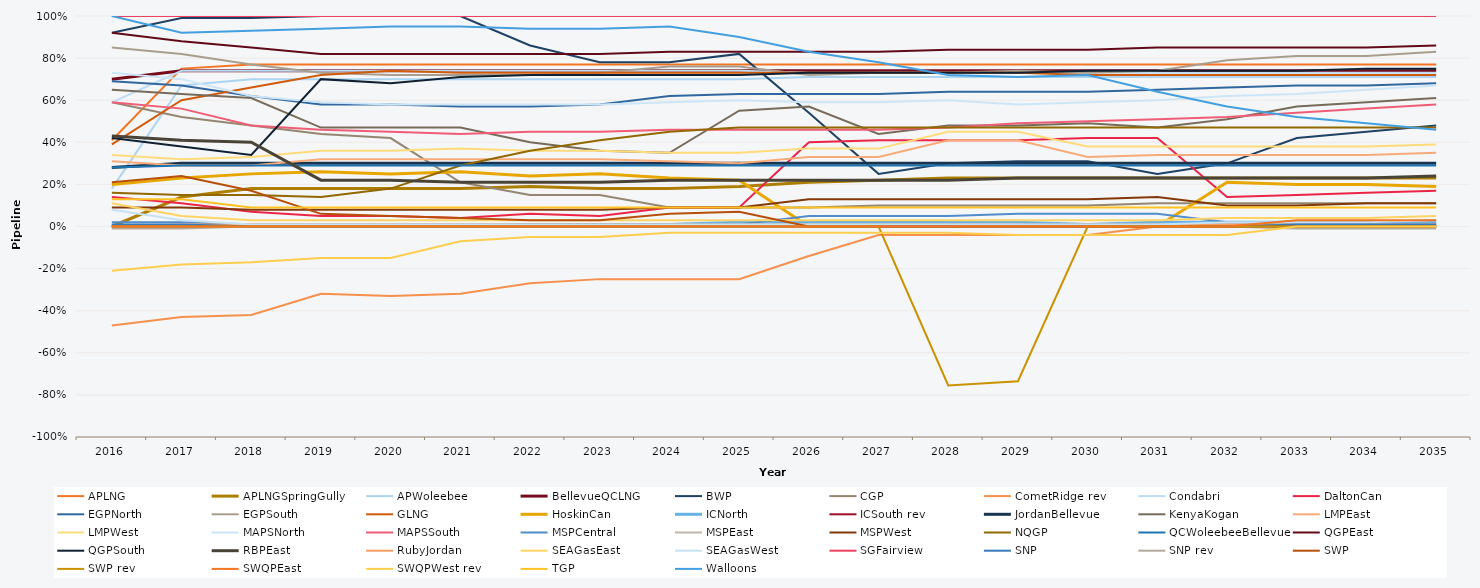
| Category | APLNG | APLNGSpringGully | APWoleebee | BellevueQCLNG | BWP | CGP | CometRidge rev | Condabri | DaltonCan | EGPNorth | EGPSouth | GLNG | HoskinCan | ICNorth | ICSouth rev | JordanBellevue | KenyaKogan | LMPEast | LMPWest | MAPSNorth | MAPSSouth | MSPCentral | MSPEast | MSPWest | NQGP | QCWoleebeeBellevue | QGPEast | QGPSouth | RBPEast | RubyJordan | SEAGasEast | SEAGasWest | SGFairview | SNP | SNP rev | SWP | SWP rev | SWQPEast | SWQPWest rev | TGP | Walloons |
|---|---|---|---|---|---|---|---|---|---|---|---|---|---|---|---|---|---|---|---|---|---|---|---|---|---|---|---|---|---|---|---|---|---|---|---|---|---|---|---|---|---|
| 2016.0 | 0.41 | 0 | 0.18 | 0.7 | 0.92 | 0.59 | -0.47 | 0.59 | 0.14 | 0.69 | 0.85 | 0.39 | 0.2 | 0 | 0 | 0.28 | 0.65 | 0.31 | 0.34 | 0.73 | 0.59 | 0.02 | 0 | 0.09 | 0.16 | 0.28 | 0.92 | 0.42 | 0.43 | 0 | 0.11 | 0.08 | 1 | 0.01 | -0.01 | 0.21 | 0 | 0 | -0.21 | 0.13 | 1 |
| 2017.0 | 0.75 | 0.14 | 0.67 | 0.74 | 0.99 | 0.52 | -0.43 | 0.74 | 0.11 | 0.67 | 0.82 | 0.6 | 0.23 | 0 | 0 | 0.3 | 0.63 | 0.29 | 0.32 | 0.7 | 0.56 | 0.02 | 0 | 0.09 | 0.15 | 0.29 | 0.88 | 0.38 | 0.41 | 0.01 | 0.05 | 0.03 | 1 | 0.01 | -0.01 | 0.24 | 0 | 0 | -0.18 | 0.13 | 0.92 |
| 2018.0 | 0.77 | 0.18 | 0.7 | 0.74 | 0.99 | 0.48 | -0.42 | 0.74 | 0.07 | 0.62 | 0.77 | 0.66 | 0.25 | 0 | 0 | 0.3 | 0.61 | 0.29 | 0.33 | 0.62 | 0.48 | 0.01 | 0 | 0.08 | 0.15 | 0.29 | 0.85 | 0.34 | 0.4 | 0.01 | 0.03 | 0.01 | 1 | 0 | 0 | 0.17 | 0 | 0 | -0.17 | 0.09 | 0.93 |
| 2019.0 | 0.77 | 0.18 | 0.7 | 0.74 | 1 | 0.44 | -0.32 | 0.74 | 0.05 | 0.58 | 0.73 | 0.72 | 0.26 | 0 | 0 | 0.3 | 0.47 | 0.32 | 0.36 | 0.59 | 0.46 | 0.01 | 0 | 0.08 | 0.14 | 0.29 | 0.82 | 0.7 | 0.22 | 0.01 | 0.03 | 0.01 | 1 | 0 | 0 | 0.06 | 0 | 0 | -0.15 | 0.09 | 0.94 |
| 2020.0 | 0.77 | 0.18 | 0.7 | 0.74 | 1 | 0.42 | -0.33 | 0.74 | 0.05 | 0.58 | 0.72 | 0.74 | 0.25 | 0 | 0 | 0.3 | 0.47 | 0.32 | 0.36 | 0.58 | 0.45 | 0.01 | 0 | 0.08 | 0.18 | 0.29 | 0.82 | 0.68 | 0.22 | 0.01 | 0.03 | 0.01 | 1 | 0 | 0 | 0.05 | 0 | 0 | -0.15 | 0.09 | 0.95 |
| 2021.0 | 0.77 | 0.18 | 0.7 | 0.74 | 1 | 0.21 | -0.32 | 0.74 | 0.04 | 0.57 | 0.72 | 0.73 | 0.26 | 0 | 0 | 0.3 | 0.47 | 0.32 | 0.37 | 0.58 | 0.44 | 0.01 | 0 | 0.08 | 0.29 | 0.29 | 0.82 | 0.71 | 0.21 | 0.01 | 0.03 | 0.01 | 1 | 0 | 0 | 0.04 | 0 | 0 | -0.07 | 0.09 | 0.95 |
| 2022.0 | 0.77 | 0.19 | 0.7 | 0.74 | 0.86 | 0.15 | -0.27 | 0.74 | 0.06 | 0.57 | 0.72 | 0.73 | 0.24 | 0.01 | 0 | 0.3 | 0.4 | 0.32 | 0.36 | 0.58 | 0.45 | 0.01 | 0 | 0.08 | 0.36 | 0.29 | 0.82 | 0.72 | 0.21 | 0.01 | 0.03 | 0.01 | 1 | 0 | 0 | 0.03 | 0 | 0 | -0.05 | 0.09 | 0.94 |
| 2023.0 | 0.77 | 0.18 | 0.7 | 0.74 | 0.78 | 0.15 | -0.25 | 0.74 | 0.05 | 0.58 | 0.73 | 0.73 | 0.25 | 0.01 | 0 | 0.3 | 0.36 | 0.32 | 0.36 | 0.58 | 0.45 | 0.01 | 0 | 0.08 | 0.41 | 0.29 | 0.82 | 0.72 | 0.21 | 0.01 | 0.03 | 0.01 | 1 | 0 | 0 | 0.03 | 0 | 0 | -0.05 | 0.09 | 0.94 |
| 2024.0 | 0.77 | 0.18 | 0.7 | 0.74 | 0.78 | 0.09 | -0.25 | 0.74 | 0.09 | 0.62 | 0.76 | 0.73 | 0.23 | 0.01 | 0 | 0.3 | 0.35 | 0.31 | 0.35 | 0.59 | 0.46 | 0.01 | 0 | 0.09 | 0.45 | 0.29 | 0.83 | 0.72 | 0.22 | 0.01 | 0.03 | 0.01 | 1 | 0 | 0 | 0.06 | 0 | 0 | -0.03 | 0.09 | 0.95 |
| 2025.0 | 0.77 | 0.19 | 0.7 | 0.74 | 0.82 | 0.09 | -0.25 | 0.74 | 0.09 | 0.63 | 0.76 | 0.73 | 0.22 | 0.02 | 0 | 0.3 | 0.55 | 0.3 | 0.35 | 0.6 | 0.46 | 0.01 | 0 | 0.09 | 0.47 | 0.29 | 0.83 | 0.72 | 0.22 | 0.01 | 0.03 | 0.01 | 1 | 0 | 0 | 0.07 | 0 | 0 | -0.03 | 0.09 | 0.9 |
| 2026.0 | 0.77 | 0.21 | 0.71 | 0.74 | 0.54 | 0.09 | -0.14 | 0.73 | 0.4 | 0.63 | 0.72 | 0.73 | 0 | 0.02 | 0 | 0.3 | 0.57 | 0.33 | 0.37 | 0.59 | 0.46 | 0.05 | 0 | 0.13 | 0.47 | 0.29 | 0.83 | 0.73 | 0.22 | 0.01 | 0.03 | 0.01 | 1 | 0 | 0 | 0 | 0 | 0 | -0.03 | 0.09 | 0.83 |
| 2027.0 | 0.77 | 0.22 | 0.71 | 0.74 | 0.25 | 0.1 | -0.04 | 0.73 | 0.41 | 0.63 | 0.73 | 0.73 | 0 | 0.02 | 0 | 0.3 | 0.44 | 0.33 | 0.37 | 0.59 | 0.46 | 0.05 | 0 | 0.13 | 0.47 | 0.29 | 0.83 | 0.73 | 0.22 | 0.01 | 0.03 | 0.01 | 1 | 0 | 0 | 0 | 0 | 0 | -0.03 | 0.09 | 0.78 |
| 2028.0 | 0.77 | 0.23 | 0.71 | 0.74 | 0.3 | 0.1 | -0.04 | 0.73 | 0.41 | 0.64 | 0.73 | 0.73 | 0 | 0.02 | 0 | 0.3 | 0.48 | 0.41 | 0.45 | 0.6 | 0.47 | 0.05 | 0 | 0.13 | 0.47 | 0.29 | 0.84 | 0.73 | 0.22 | 0.01 | 0.03 | 0.01 | 1 | 0 | 0 | 0 | -0.755 | 0 | -0.03 | 0.09 | 0.72 |
| 2029.0 | 0.77 | 0.23 | 0.71 | 0.74 | 0.31 | 0.1 | -0.04 | 0.73 | 0.41 | 0.64 | 0.74 | 0.73 | 0 | 0.02 | 0 | 0.3 | 0.48 | 0.41 | 0.45 | 0.58 | 0.49 | 0.06 | 0 | 0.13 | 0.47 | 0.29 | 0.84 | 0.73 | 0.23 | 0.01 | 0.03 | 0.01 | 1 | 0 | 0 | 0 | -0.735 | 0 | -0.04 | 0.09 | 0.71 |
| 2030.0 | 0.77 | 0.23 | 0.71 | 0.74 | 0.31 | 0.1 | -0.04 | 0.73 | 0.42 | 0.64 | 0.73 | 0.72 | 0 | 0.01 | 0 | 0.3 | 0.49 | 0.33 | 0.38 | 0.59 | 0.5 | 0.06 | 0 | 0.13 | 0.47 | 0.29 | 0.84 | 0.74 | 0.23 | 0.01 | 0.03 | 0.01 | 1 | 0 | 0 | 0 | 0 | 0 | -0.04 | 0.09 | 0.72 |
| 2031.0 | 0.77 | 0.23 | 0.71 | 0.74 | 0.25 | 0.11 | 0 | 0.73 | 0.42 | 0.65 | 0.74 | 0.72 | 0 | 0.02 | 0 | 0.3 | 0.47 | 0.34 | 0.38 | 0.6 | 0.51 | 0.06 | 0.01 | 0.14 | 0.47 | 0.29 | 0.85 | 0.74 | 0.23 | 0.01 | 0.03 | 0.01 | 1 | 0 | 0 | 0 | 0 | 0 | -0.04 | 0.09 | 0.64 |
| 2032.0 | 0.77 | 0.23 | 0.71 | 0.74 | 0.3 | 0.11 | 0 | 0.73 | 0.14 | 0.66 | 0.79 | 0.72 | 0.21 | 0.02 | 0 | 0.3 | 0.51 | 0.34 | 0.38 | 0.62 | 0.52 | 0.02 | 0.01 | 0.1 | 0.47 | 0.29 | 0.85 | 0.74 | 0.23 | 0.01 | 0.04 | 0.02 | 1 | 0 | 0 | 0 | 0 | 0 | -0.04 | 0.09 | 0.57 |
| 2033.0 | 0.77 | 0.23 | 0.71 | 0.74 | 0.42 | 0.11 | 0 | 0.73 | 0.15 | 0.67 | 0.81 | 0.72 | 0.2 | 0.02 | 0 | 0.3 | 0.57 | 0.34 | 0.38 | 0.63 | 0.54 | 0.02 | 0 | 0.1 | 0.47 | 0.29 | 0.85 | 0.74 | 0.23 | 0.01 | 0.04 | 0.02 | 1 | 0.01 | -0.01 | 0 | 0 | 0.03 | 0 | 0.09 | 0.52 |
| 2034.0 | 0.77 | 0.23 | 0.71 | 0.74 | 0.45 | 0.11 | 0 | 0.73 | 0.16 | 0.67 | 0.81 | 0.72 | 0.2 | 0.02 | 0 | 0.3 | 0.59 | 0.34 | 0.38 | 0.65 | 0.56 | 0.02 | 0 | 0.11 | 0.47 | 0.29 | 0.85 | 0.75 | 0.23 | 0.01 | 0.04 | 0.02 | 1 | 0.01 | -0.01 | 0 | 0 | 0.03 | 0 | 0.09 | 0.49 |
| 2035.0 | 0.77 | 0.23 | 0.71 | 0.74 | 0.48 | 0.11 | 0 | 0.73 | 0.17 | 0.68 | 0.83 | 0.72 | 0.19 | 0.02 | 0 | 0.3 | 0.61 | 0.35 | 0.39 | 0.67 | 0.58 | 0.03 | 0.01 | 0.11 | 0.47 | 0.29 | 0.86 | 0.75 | 0.24 | 0.01 | 0.05 | 0.03 | 1 | 0.01 | -0.01 | 0 | 0 | 0.03 | 0 | 0.09 | 0.46 |